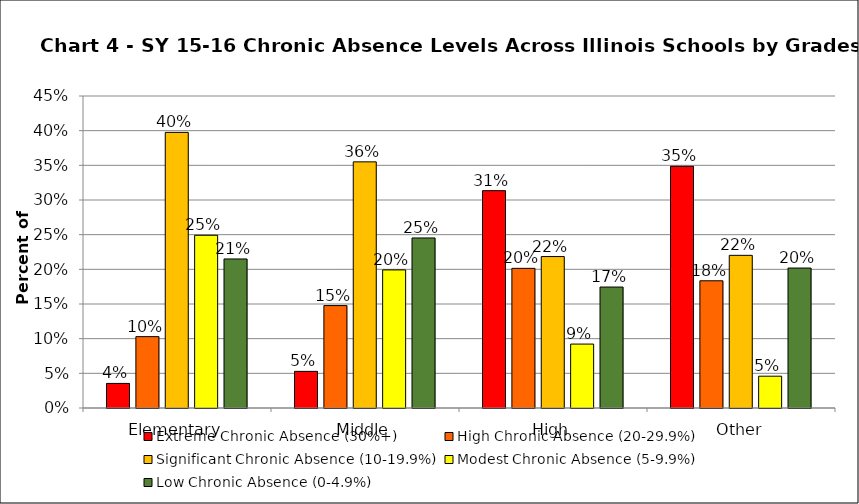
| Category | Extreme Chronic Absence (30%+) | High Chronic Absence (20-29.9%) | Significant Chronic Absence (10-19.9%) | Modest Chronic Absence (5-9.9%) | Low Chronic Absence (0-4.9%) |
|---|---|---|---|---|---|
| 0 | 0.035 | 0.103 | 0.397 | 0.249 | 0.215 |
| 1 | 0.053 | 0.148 | 0.355 | 0.199 | 0.245 |
| 2 | 0.313 | 0.201 | 0.218 | 0.092 | 0.174 |
| 3 | 0.349 | 0.183 | 0.22 | 0.046 | 0.202 |